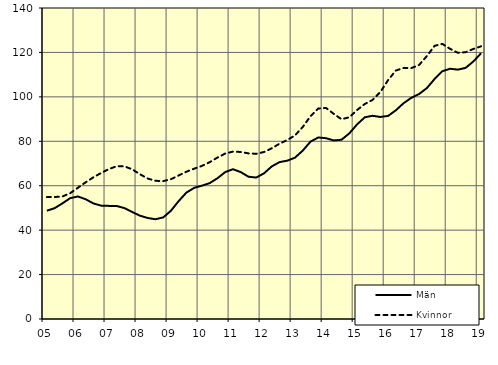
| Category | Män | Kvinnor |
|---|---|---|
| 5.0 | 48.74 | 54.88 |
| nan | 49.89 | 54.92 |
| 6.0 | 52.05 | 55.14 |
| 6.0 | 54.4 | 56.61 |
| 6.0 | 55.15 | 59.08 |
| nan | 53.91 | 61.53 |
| 7.0 | 52.02 | 63.79 |
| 7.0 | 51.02 | 65.75 |
| 7.0 | 50.92 | 67.48 |
| nan | 50.87 | 68.79 |
| 8.0 | 49.93 | 68.73 |
| 8.0 | 48.16 | 67.37 |
| 8.0 | 46.52 | 65.17 |
| nan | 45.47 | 63.23 |
| 9.0 | 44.91 | 62.22 |
| 9.0 | 45.73 | 62.06 |
| 9.0 | 48.73 | 62.93 |
| nan | 53.1 | 64.63 |
| 10.0 | 56.93 | 66.32 |
| 10.0 | 59.04 | 67.67 |
| 10.0 | 60.03 | 68.92 |
| nan | 61.17 | 70.59 |
| 11.0 | 63.37 | 72.68 |
| 11.0 | 66.14 | 74.48 |
| 11.0 | 67.43 | 75.35 |
| nan | 66.13 | 75.2 |
| 12.0 | 64.04 | 74.55 |
| 12.0 | 63.68 | 74.38 |
| 12.0 | 65.57 | 75.17 |
| nan | 68.68 | 76.85 |
| 13.0 | 70.62 | 78.91 |
| 13.0 | 71.28 | 80.57 |
| 13.0 | 72.64 | 82.65 |
| nan | 75.81 | 86.45 |
| 14.0 | 79.86 | 91.31 |
| 14.0 | 81.71 | 94.76 |
| 14.0 | 81.39 | 95 |
| nan | 80.38 | 92.33 |
| 15.0 | 80.7 | 89.9 |
| 15.0 | 83.55 | 90.83 |
| 15.0 | 87.59 | 94.06 |
| nan | 90.81 | 96.78 |
| 16.0 | 91.48 | 98.63 |
| 16.0 | 90.95 | 102.16 |
| 16.0 | 91.42 | 107.53 |
| nan | 93.94 | 111.84 |
| 17.0 | 97.14 | 113 |
| 17.0 | 99.58 | 112.95 |
| 17.0 | 101.27 | 114.34 |
| nan | 103.94 | 118.36 |
| 18.0 | 108.05 | 122.97 |
| 18.0 | 111.54 | 123.84 |
| 18.0 | 112.66 | 121.62 |
| nan | 112.25 | 119.84 |
| 19.0 | 113.04 | 120.09 |
| 19.0 | 115.94 | 121.57 |
| 19.0 | 119.65 | 122.75 |